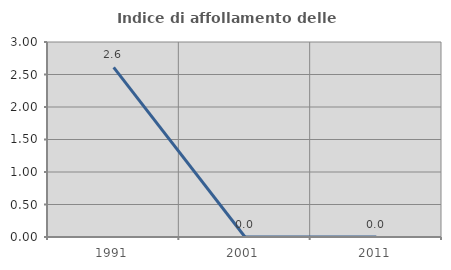
| Category | Indice di affollamento delle abitazioni  |
|---|---|
| 1991.0 | 2.609 |
| 2001.0 | 0 |
| 2011.0 | 0 |